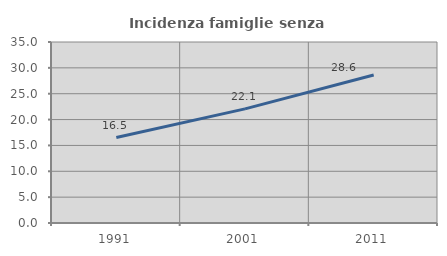
| Category | Incidenza famiglie senza nuclei |
|---|---|
| 1991.0 | 16.521 |
| 2001.0 | 22.07 |
| 2011.0 | 28.628 |